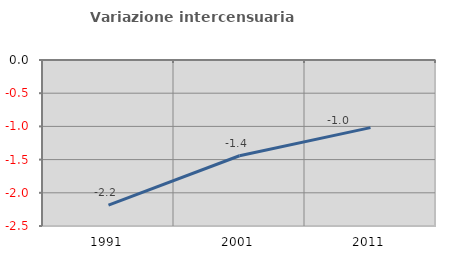
| Category | Variazione intercensuaria annua |
|---|---|
| 1991.0 | -2.187 |
| 2001.0 | -1.442 |
| 2011.0 | -1.019 |